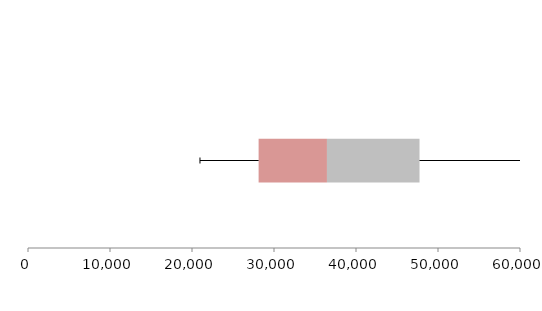
| Category | Series 1 | Series 2 | Series 3 |
|---|---|---|---|
| 0 | 28123.59 | 8334.229 | 11287.422 |